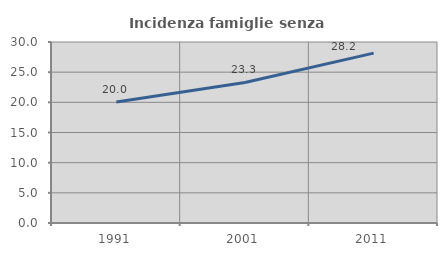
| Category | Incidenza famiglie senza nuclei |
|---|---|
| 1991.0 | 20.041 |
| 2001.0 | 23.291 |
| 2011.0 | 28.156 |